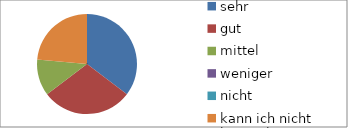
| Category | Series 0 |
|---|---|
| sehr | 6 |
| gut | 5 |
| mittel | 2 |
| weniger | 0 |
| nicht | 0 |
| kann ich nicht beurteilen | 4 |
| keine Angabe | 0 |